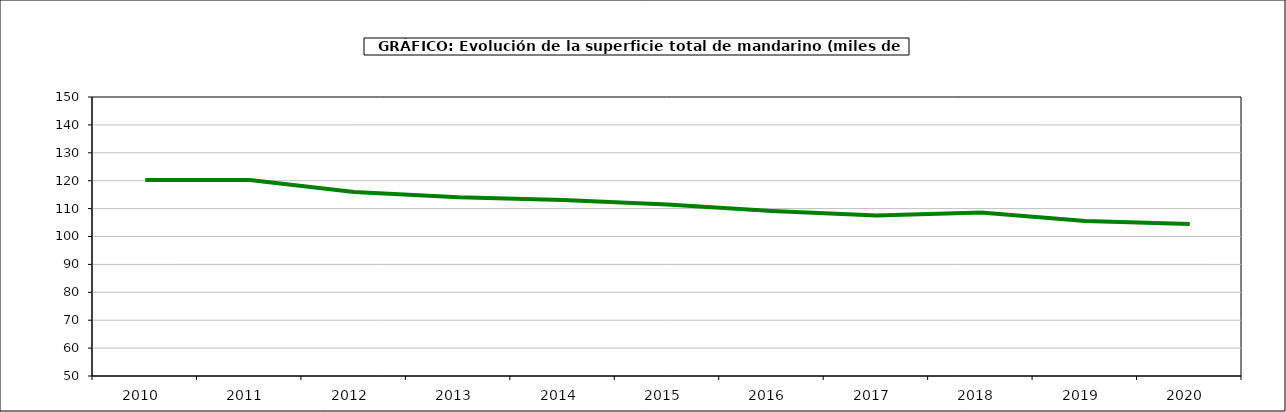
| Category | superficie |
|---|---|
| 2010.0 | 120.256 |
| 2011.0 | 120.212 |
| 2012.0 | 115.927 |
| 2013.0 | 114.076 |
| 2014.0 | 113.102 |
| 2015.0 | 111.467 |
| 2016.0 | 109.127 |
| 2017.0 | 107.515 |
| 2018.0 | 108.613 |
| 2019.0 | 105.583 |
| 2020.0 | 104.496 |